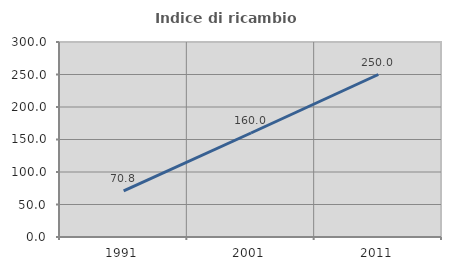
| Category | Indice di ricambio occupazionale  |
|---|---|
| 1991.0 | 70.833 |
| 2001.0 | 160 |
| 2011.0 | 250 |